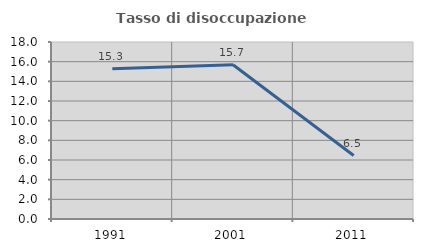
| Category | Tasso di disoccupazione giovanile  |
|---|---|
| 1991.0 | 15.278 |
| 2001.0 | 15.686 |
| 2011.0 | 6.452 |